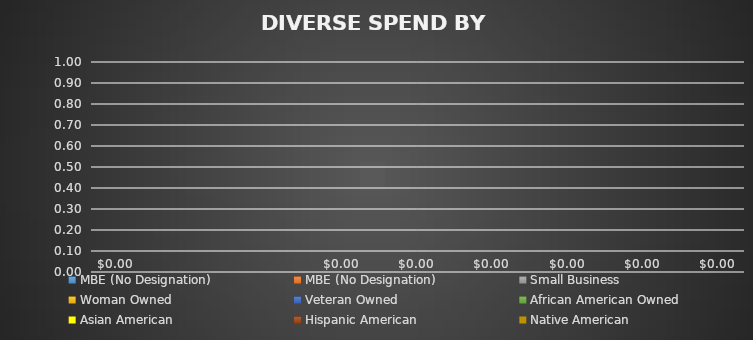
| Category | MBE (No Designation) | Small Business | Woman Owned | Veteran Owned | African American Owned | Asian American | Hispanic American | Native American |
|---|---|---|---|---|---|---|---|---|
| 0 | 0 | 0 | 0 | 0 | 0 | 0 | 0 | 0 |